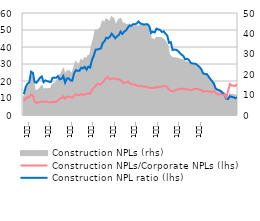
| Category | Construction NPL ratio (lhs) | Construction NPLs/Corporate NPLs (lhs) |
|---|---|---|
|  | 12.298 | 7.953 |
|  | 16.411 | 9.964 |
|  | 18.367 | 10.307 |
|  | 19.169 | 10.429 |
| 6
2009 | 25.433 | 12.171 |
|  | 24.835 | 11.492 |
|  | 19.256 | 7.802 |
|  | 18.981 | 7.244 |
|  | 20.435 | 7.307 |
|  | 21.895 | 7.598 |
| 12 | 22.645 | 8.082 |
| 1
2010 | 19.291 | 7.791 |
|  | 20.325 | 7.901 |
|  | 19.909 | 7.77 |
|  | 19.587 | 7.459 |
|  | 19.384 | 7.403 |
| 6
2010 | 21.841 | 7.803 |
|  | 21.9 | 7.569 |
|  | 21.893 | 7.585 |
|  | 22.897 | 8.602 |
|  | 20.957 | 9.578 |
|  | 21.316 | 9.883 |
| 12 | 22.951 | 10.902 |
| 1
2011 | 19.044 | 9.605 |
|  | 21.464 | 10.773 |
|  | 21.647 | 10.817 |
|  | 20.33 | 10.537 |
|  | 20.222 | 10.213 |
| 6
2011 | 24.486 | 11.167 |
|  | 26.307 | 12.286 |
|  | 26.025 | 11.63 |
|  | 26.069 | 11.734 |
|  | 27.804 | 12.439 |
|  | 27.388 | 11.715 |
| 12 | 28.322 | 12.235 |
| 1
2012 | 26.666 | 12.303 |
|  | 28.495 | 12.822 |
|  | 27.903 | 12.414 |
|  | 32.444 | 14.729 |
|  | 34.841 | 15.967 |
| 6
2012 | 38.393 | 17.166 |
|  | 38.504 | 18.425 |
|  | 38.824 | 18.02 |
|  | 39.218 | 18.083 |
|  | 42.401 | 19.329 |
|  | 43.421 | 20.716 |
| 12 | 45.464 | 21.691 |
| 1
2013 | 45.077 | 22.315 |
|  | 46.093 | 20.946 |
|  | 47.827 | 21.339 |
|  | 46.562 | 21.484 |
|  | 45.129 | 21.378 |
| 6
2013 | 46.309 | 20.985 |
|  | 47.078 | 21.124 |
|  | 49.061 | 20.535 |
|  | 47.719 | 19.305 |
|  | 49.11 | 18.858 |
|  | 49.753 | 19.235 |
| 12 | 51.351 | 19.613 |
| 1
2014 | 52.672 | 18.623 |
|  | 52.459 | 18.13 |
|  | 53.449 | 18.092 |
|  | 53.4 | 17.773 |
|  | 53.814 | 17.325 |
| 6
2014 | 55.031 | 16.909 |
|  | 53.856 | 17.062 |
|  | 53.532 | 17.007 |
|  | 53.153 | 16.589 |
|  | 53.392 | 16.713 |
|  | 53.438 | 16.409 |
| 12 | 52.2 | 16.064 |
| 1
2015 | 48.26 | 15.867 |
|  | 48.994 | 15.97 |
|  | 48.54 | 16.023 |
|  | 50.819 | 16.5 |
|  | 50.398 | 16.224 |
| 6
2015 | 50.034 | 16.529 |
|  | 48.852 | 16.755 |
|  | 49.2 | 17.08 |
|  | 47.851 | 17.074 |
|  | 46.8 | 16.302 |
|  | 42.497 | 15.02 |
| 12 | 42.897 | 14.115 |
| 1
2016 | 38.217 | 14.005 |
|  | 38.481 | 14.086 |
|  | 38.357 | 14.828 |
|  | 37.683 | 15.073 |
|  | 36.469 | 15.098 |
| 6
2016 | 35.485 | 15.671 |
|  | 34.686 | 15.189 |
|  | 32.812 | 15.006 |
|  | 33.031 | 15.257 |
|  | 32.472 | 14.824 |
|  | 30.854 | 14.772 |
| 12 | 30.237 | 14.756 |
| 1
2017 | 30.25 | 15.536 |
|  | 30.017 | 15.275 |
|  | 29.166 | 15.356 |
|  | 28.279 | 14.979 |
|  | 26.947 | 14.796 |
| 6
2017 | 24.631 | 13.709 |
|  | 24.106 | 14.046 |
|  | 24.082 | 14.052 |
|  | 22.783 | 13.837 |
|  | 21.226 | 13.72 |
|  | 19.97 | 13.447 |
| 12 | 18.452 | 14.114 |
| 1
2018 | 15.625 | 12.822 |
|  | 14.94 | 12.128 |
|  | 14.54 | 12.227 |
|  | 13.92 | 12.239 |
|  | 12.85 | 11.727 |
| 6
2018 | 11.9 | 11.834 |
|  | 9.5 | 10.392 |
|  | 9.47 | 14.361 |
|  | 11.06 | 18.232 |
|  | 10.59 | 17.345 |
|  | 10.44 | 17.269 |
| 12 | 9.88 | 17.028 |